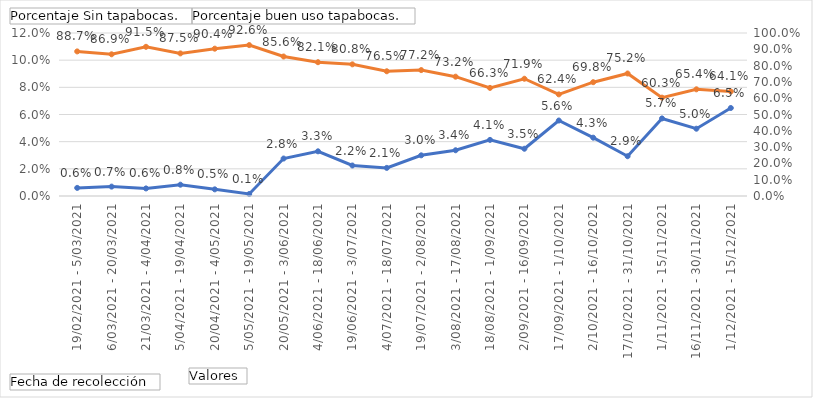
| Category | Porcentaje Sin tapabocas. |
|---|---|
| 19/02/2021 - 5/03/2021 | 0.006 |
| 6/03/2021 - 20/03/2021 | 0.007 |
| 21/03/2021 - 4/04/2021 | 0.006 |
| 5/04/2021 - 19/04/2021 | 0.008 |
| 20/04/2021 - 4/05/2021 | 0.005 |
| 5/05/2021 - 19/05/2021 | 0.001 |
| 20/05/2021 - 3/06/2021 | 0.028 |
| 4/06/2021 - 18/06/2021 | 0.033 |
| 19/06/2021 - 3/07/2021 | 0.022 |
| 4/07/2021 - 18/07/2021 | 0.021 |
| 19/07/2021 - 2/08/2021 | 0.03 |
| 3/08/2021 - 17/08/2021 | 0.034 |
| 18/08/2021 - 1/09/2021 | 0.041 |
| 2/09/2021 - 16/09/2021 | 0.035 |
| 17/09/2021 - 1/10/2021 | 0.056 |
| 2/10/2021 - 16/10/2021 | 0.043 |
| 17/10/2021 - 31/10/2021 | 0.029 |
| 1/11/2021 - 15/11/2021 | 0.057 |
| 16/11/2021 - 30/11/2021 | 0.05 |
| 1/12/2021 - 15/12/2021 | 0.065 |